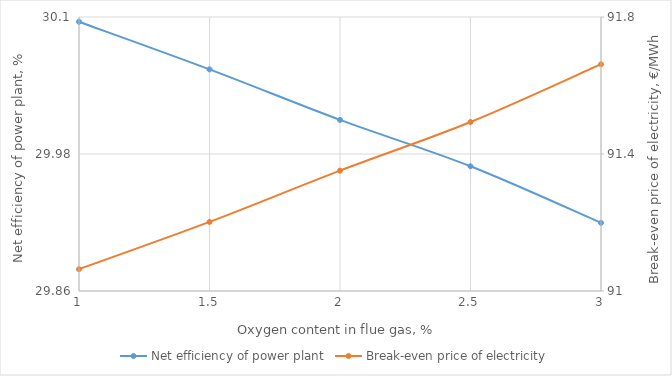
| Category | Net efficiency of power plant |
|---|---|
| 3.0 | 29.92 |
| 2.5 | 29.969 |
| 2.0 | 30.01 |
| 1.5 | 30.054 |
| 1.0 | 30.096 |